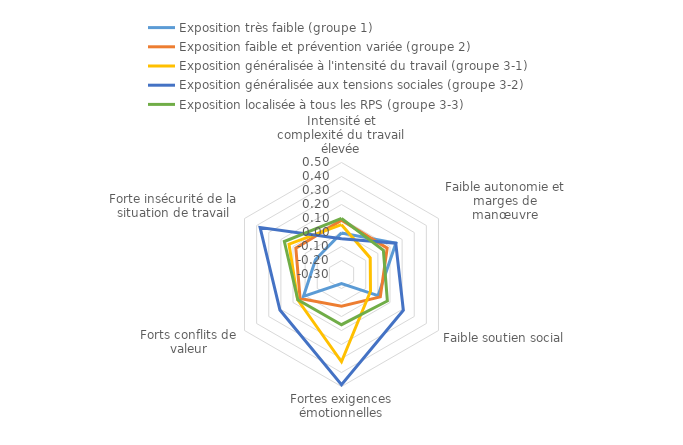
| Category | Exposition très faible (groupe 1) | Exposition faible et prévention variée (groupe 2) | Exposition généralisée à l'intensité du travail (groupe 3-1) | Exposition généralisée aux tensions sociales (groupe 3-2) | Exposition localisée à tous les RPS (groupe 3-3) |
|---|---|---|---|---|---|
| Intensité et complexité du travail élevée | -0.003 | 0.089 | 0.056 | -0.045 | 0.1 |
| Faible autonomie et marges de manœuvre | 0.149 | 0.077 | -0.063 | 0.147 | 0.045 |
| Faible soutien social | 0.002 | 0.02 | -0.061 | 0.21 | 0.078 |
| Fortes exigences émotionnelles | -0.234 | -0.073 | 0.323 | 0.487 | 0.058 |
| Forts conflits de valeur | 0.014 | 0.042 | 0.061 | 0.208 | 0.06 |
| Forte insécurité de la situation de travail | -0.086 | 0.077 | 0.133 | 0.371 | 0.171 |